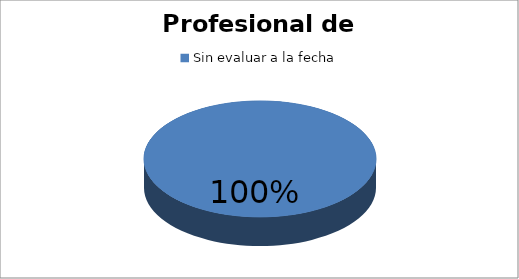
| Category | Cantidad |
|---|---|
| Sin evaluar a la fecha | 7 |